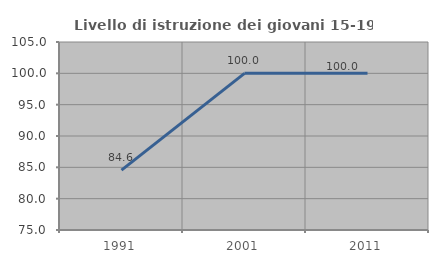
| Category | Livello di istruzione dei giovani 15-19 anni |
|---|---|
| 1991.0 | 84.553 |
| 2001.0 | 100 |
| 2011.0 | 100 |